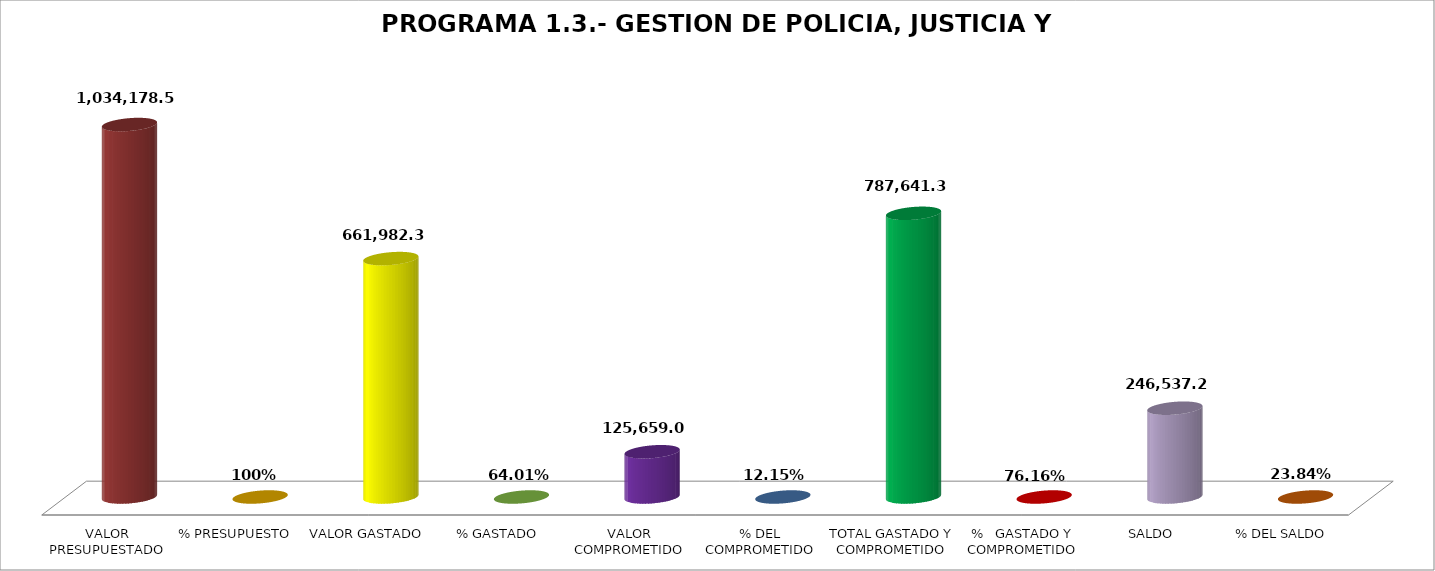
| Category | PROGRAMA 1.3.- GESTION DE POLICIA, JUSTICIA Y VIGILANCIA |
|---|---|
| VALOR PRESUPUESTADO | 1034178.54 |
| % PRESUPUESTO | 1 |
| VALOR GASTADO | 661982.32 |
| % GASTADO | 0.64 |
| VALOR COMPROMETIDO | 125659.02 |
| % DEL COMPROMETIDO | 0.122 |
| TOTAL GASTADO Y COMPROMETIDO | 787641.34 |
| %   GASTADO Y COMPROMETIDO | 0.762 |
| SALDO | 246537.2 |
| % DEL SALDO | 0.238 |